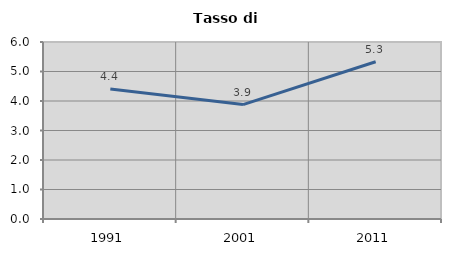
| Category | Tasso di disoccupazione   |
|---|---|
| 1991.0 | 4.409 |
| 2001.0 | 3.879 |
| 2011.0 | 5.33 |